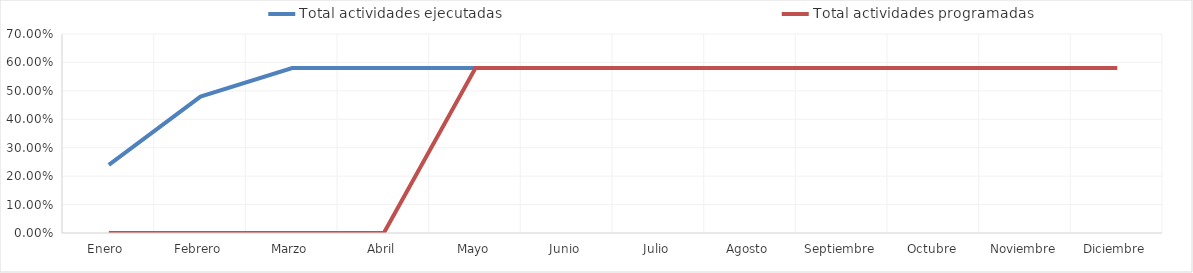
| Category | Total actividades ejecutadas  | Total actividades programadas |
|---|---|---|
| Enero  | 0.24 | 0 |
| Febrero | 0.48 | 0 |
| Marzo | 0.58 | 0 |
| Abril | 0.58 | 0 |
| Mayo | 0.58 | 0.58 |
| Junio | 0.58 | 0.58 |
| Julio | 0.58 | 0.58 |
| Agosto | 0.58 | 0.58 |
| Septiembre | 0.58 | 0.58 |
| Octubre | 0.58 | 0.58 |
| Noviembre | 0.58 | 0.58 |
| Diciembre | 0.58 | 0.58 |